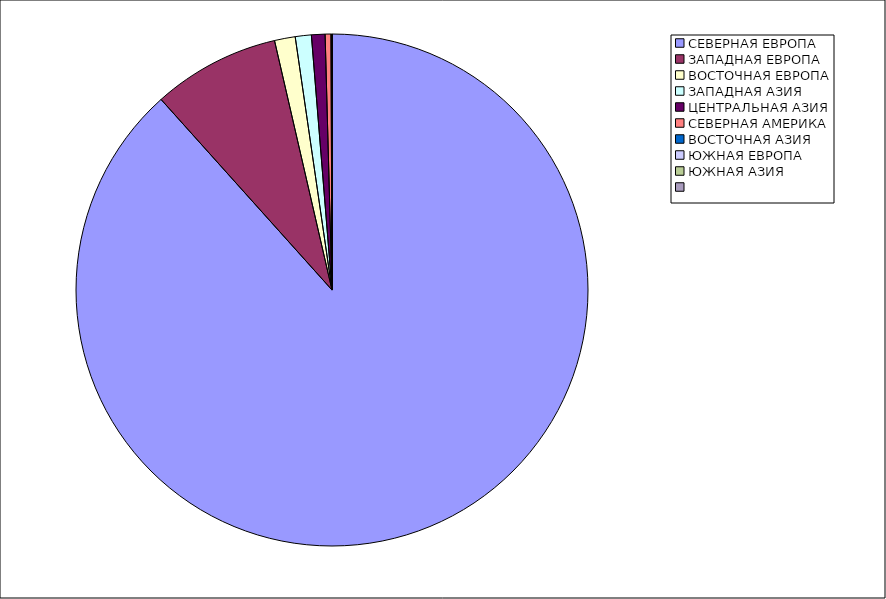
| Category | Оборот |
|---|---|
| СЕВЕРНАЯ ЕВРОПА | 88.361 |
| ЗАПАДНАЯ ЕВРОПА | 8.033 |
| ВОСТОЧНАЯ ЕВРОПА | 1.308 |
| ЗАПАДНАЯ АЗИЯ | 1.013 |
| ЦЕНТРАЛЬНАЯ АЗИЯ | 0.856 |
| СЕВЕРНАЯ АМЕРИКА | 0.365 |
| ВОСТОЧНАЯ АЗИЯ | 0.047 |
| ЮЖНАЯ ЕВРОПА | 0.017 |
| ЮЖНАЯ АЗИЯ | 0 |